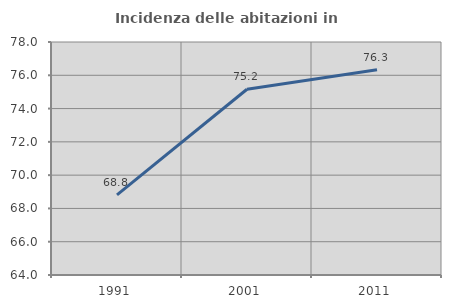
| Category | Incidenza delle abitazioni in proprietà  |
|---|---|
| 1991.0 | 68.81 |
| 2001.0 | 75.162 |
| 2011.0 | 76.328 |